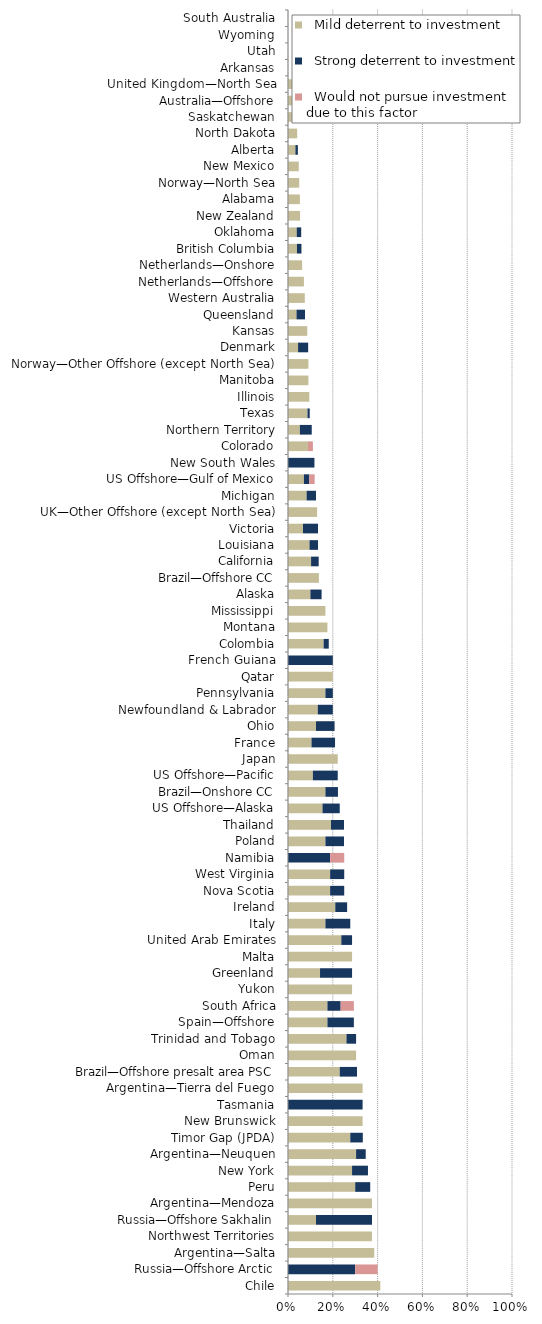
| Category |   Mild deterrent to investment |   Strong deterrent to investment |   Would not pursue investment due to this factor |
|---|---|---|---|
| Chile | 0.412 | 0 | 0 |
| Russia—Offshore Arctic | 0 | 0.3 | 0.1 |
| Argentina—Salta | 0.385 | 0 | 0 |
| Northwest Territories | 0.375 | 0 | 0 |
| Russia—Offshore Sakhalin | 0.125 | 0.25 | 0 |
| Argentina—Mendoza | 0.375 | 0 | 0 |
| Peru | 0.3 | 0.067 | 0 |
| New York | 0.286 | 0.071 | 0 |
| Argentina—Neuquen | 0.304 | 0.043 | 0 |
| Timor Gap (JPDA) | 0.278 | 0.056 | 0 |
| New Brunswick | 0.333 | 0 | 0 |
| Tasmania | 0 | 0.333 | 0 |
| Argentina—Tierra del Fuego | 0.333 | 0 | 0 |
| Brazil—Offshore presalt area PSC | 0.231 | 0.077 | 0 |
| Oman | 0.304 | 0 | 0 |
| Trinidad and Tobago | 0.261 | 0.043 | 0 |
| Spain—Offshore | 0.176 | 0.118 | 0 |
| South Africa | 0.176 | 0.059 | 0.059 |
| Yukon | 0.286 | 0 | 0 |
| Greenland | 0.143 | 0.143 | 0 |
| Malta | 0.286 | 0 | 0 |
| United Arab Emirates | 0.238 | 0.048 | 0 |
| Italy | 0.167 | 0.111 | 0 |
| Ireland | 0.211 | 0.053 | 0 |
| Nova Scotia | 0.188 | 0.063 | 0 |
| West Virginia | 0.188 | 0.063 | 0 |
| Namibia | 0 | 0.188 | 0.063 |
| Poland | 0.167 | 0.083 | 0 |
| Thailand | 0.192 | 0.058 | 0 |
| US Offshore—Alaska | 0.154 | 0.077 | 0 |
| Brazil—Onshore CC | 0.167 | 0.056 | 0 |
| US Offshore—Pacific | 0.111 | 0.111 | 0 |
| Japan | 0.222 | 0 | 0 |
| France | 0.105 | 0.105 | 0 |
| Ohio | 0.125 | 0.083 | 0 |
| Newfoundland & Labrador | 0.133 | 0.067 | 0 |
| Pennsylvania | 0.167 | 0.033 | 0 |
| Qatar | 0.2 | 0 | 0 |
| French Guiana | 0 | 0.2 | 0 |
| Colombia | 0.159 | 0.023 | 0 |
| Montana | 0.176 | 0 | 0 |
| Mississippi | 0.167 | 0 | 0 |
| Alaska | 0.1 | 0.05 | 0 |
| Brazil—Offshore CC | 0.138 | 0 | 0 |
| California | 0.103 | 0.034 | 0 |
| Louisiana | 0.096 | 0.038 | 0 |
| Victoria | 0.067 | 0.067 | 0 |
| UK—Other Offshore (except North Sea) | 0.13 | 0 | 0 |
| Michigan | 0.083 | 0.042 | 0 |
| US Offshore—Gulf of Mexico | 0.071 | 0.024 | 0.024 |
| New South Wales | 0 | 0.118 | 0 |
| Colorado | 0.089 | 0 | 0.022 |
| Northern Territory | 0.053 | 0.053 | 0 |
| Texas | 0.087 | 0.01 | 0 |
| Illinois | 0.095 | 0 | 0 |
| Manitoba | 0.091 | 0 | 0 |
| Norway—Other Offshore (except North Sea) | 0.091 | 0 | 0 |
| Denmark | 0.045 | 0.045 | 0 |
| Kansas | 0.086 | 0 | 0 |
| Queensland | 0.038 | 0.038 | 0 |
| Western Australia | 0.075 | 0 | 0 |
| Netherlands—Offshore | 0.071 | 0 | 0 |
| Netherlands—Onshore | 0.063 | 0 | 0 |
| British Columbia | 0.04 | 0.02 | 0 |
| Oklahoma | 0.039 | 0.02 | 0 |
| New Zealand | 0.054 | 0 | 0 |
| Alabama | 0.053 | 0 | 0 |
| Norway—North Sea | 0.05 | 0 | 0 |
| New Mexico | 0.048 | 0 | 0 |
| Alberta | 0.033 | 0.011 | 0 |
| North Dakota | 0.041 | 0 | 0 |
| Saskatchewan | 0.026 | 0 | 0 |
| Australia—Offshore | 0.024 | 0 | 0 |
| United Kingdom—North Sea | 0.024 | 0 | 0 |
| Arkansas | 0 | 0 | 0 |
| Utah | 0 | 0 | 0 |
| Wyoming | 0 | 0 | 0 |
| South Australia | 0 | 0 | 0 |